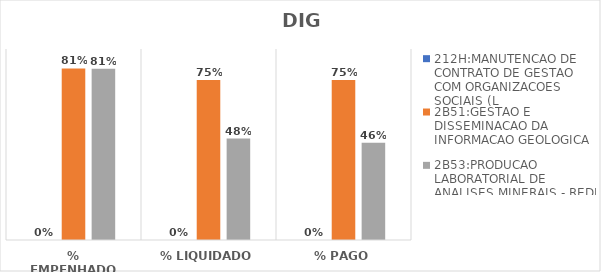
| Category | 212H:MANUTENCAO DE CONTRATO DE GESTAO COM ORGANIZACOES SOCIAIS (L | 2B51:GESTAO E DISSEMINACAO DA INFORMACAO GEOLOGICA | 2B53:PRODUCAO LABORATORIAL DE ANALISES MINERAIS - REDE LAMIN |
|---|---|---|---|
| % EMPENHADO | 0 | 0.808 | 0.806 |
| % LIQUIDADO | 0 | 0.754 | 0.478 |
| % PAGO | 0 | 0.754 | 0.458 |